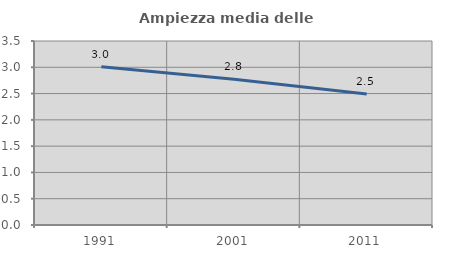
| Category | Ampiezza media delle famiglie |
|---|---|
| 1991.0 | 3.008 |
| 2001.0 | 2.774 |
| 2011.0 | 2.49 |